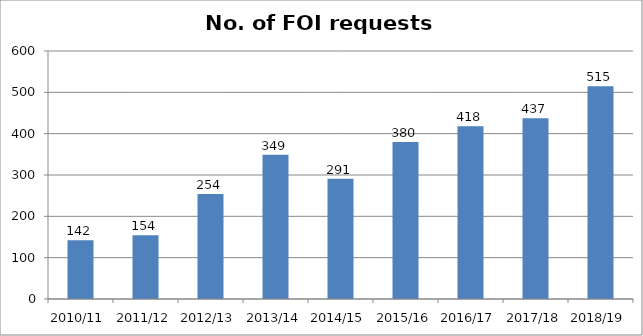
| Category | Series 0 |
|---|---|
| 2010/11 | 142 |
| 2011/12 | 154 |
| 2012/13 | 254 |
| 2013/14 | 349 |
| 2014/15 | 291 |
| 2015/16 | 380 |
| 2016/17 | 418 |
| 2017/18 | 437 |
| 2018/19 | 515 |